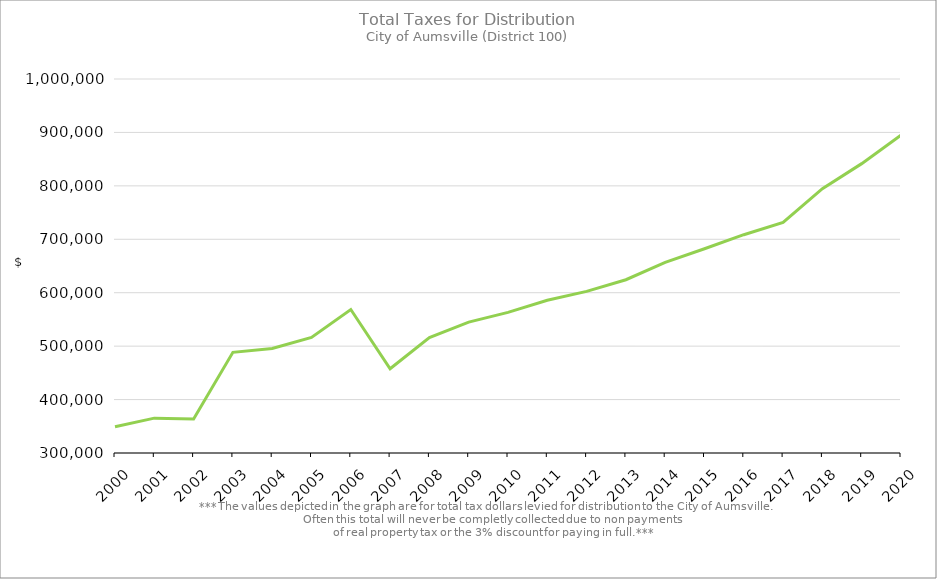
| Category | Series 0 |
|---|---|
| 2000.0 | 349036.91 |
| 2001.0 | 365210.68 |
| 2002.0 | 363752.99 |
| 2003.0 | 488399.85 |
| 2004.0 | 495685.78 |
| 2005.0 | 516350.08 |
| 2006.0 | 568517.55 |
| 2007.0 | 457760.5 |
| 2008.0 | 516155.17 |
| 2009.0 | 544963.19 |
| 2010.0 | 563223.84 |
| 2011.0 | 585780.4 |
| 2012.0 | 602496.99 |
| 2013.0 | 624308.8 |
| 2014.0 | 656658.85 |
| 2015.0 | 682325.57 |
| 2016.0 | 708593.77 |
| 2017.0 | 731439.06 |
| 2018.0 | 794672.37 |
| 2019.0 | 841585.72 |
| 2020.0 | 894860.26 |